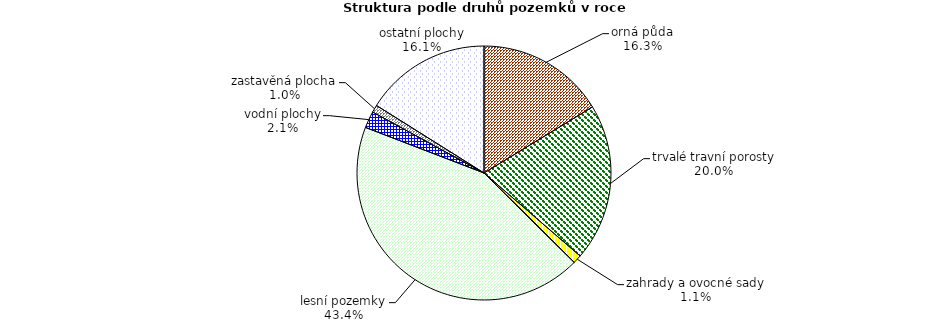
| Category | Struktura druhů pozemků |
|---|---|
| orná půda | 53997.915 |
| trvalé travní porosty | 66420.36 |
| zahrady a ovocné sady | 3609.006 |
| chmelnice a vinice | 0 |
| lesní pozemky | 143886.05 |
| vodní plochy | 7080.137 |
| zastavěná plocha | 3151.34 |
| ostatní plochy | 53281.534 |